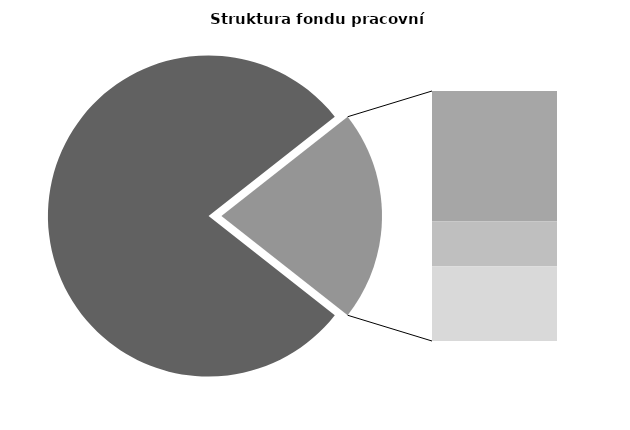
| Category | Series 0 |
|---|---|
| Průměrná měsíční odpracovaná doba bez přesčasu | 135.274 |
| Dovolená | 18.958 |
| Nemoc | 6.568 |
| Jiné | 10.894 |